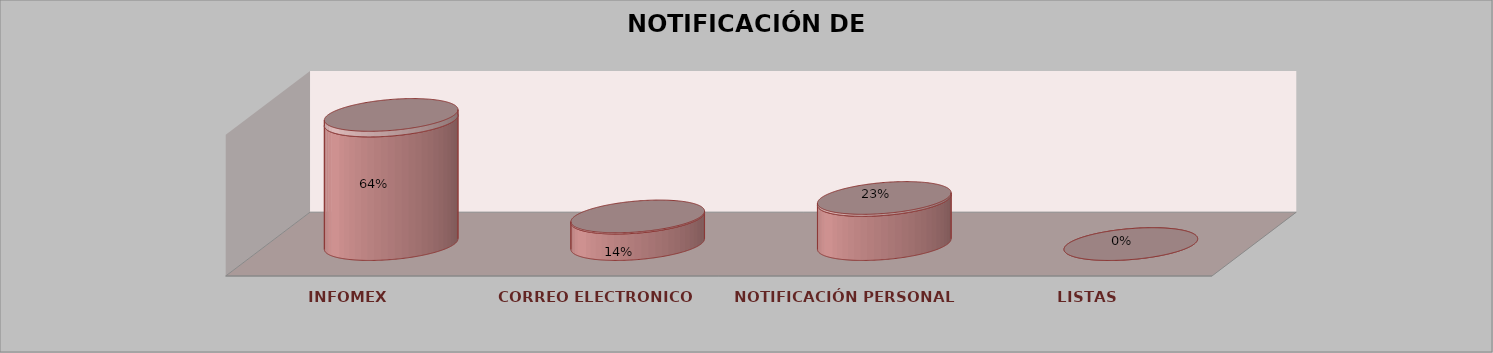
| Category | Series 0 | Series 1 | Series 2 | Series 3 | Series 4 |
|---|---|---|---|---|---|
| INFOMEX |  |  |  | 14 | 0.636 |
| CORREO ELECTRONICO |  |  |  | 3 | 0.136 |
| NOTIFICACIÓN PERSONAL |  |  |  | 5 | 0.227 |
| LISTAS |  |  |  | 0 | 0 |